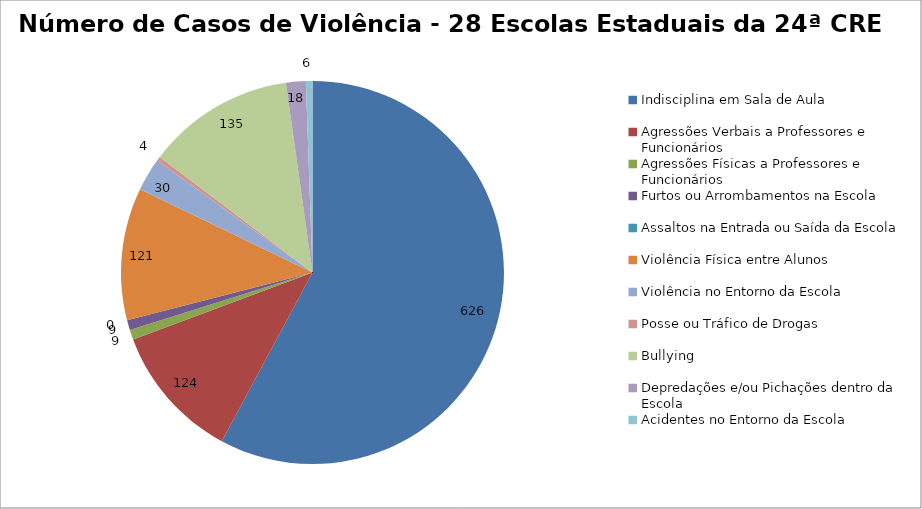
| Category | Número de Casos |
|---|---|
| Indisciplina em Sala de Aula | 626 |
| Agressões Verbais a Professores e Funcionários | 124 |
| Agressões Físicas a Professores e Funcionários | 9 |
| Furtos ou Arrombamentos na Escola | 9 |
| Assaltos na Entrada ou Saída da Escola | 0 |
| Violência Física entre Alunos | 121 |
| Violência no Entorno da Escola | 30 |
| Posse ou Tráfico de Drogas | 4 |
| Bullying | 135 |
| Depredações e/ou Pichações dentro da Escola | 18 |
| Acidentes no Entorno da Escola | 6 |